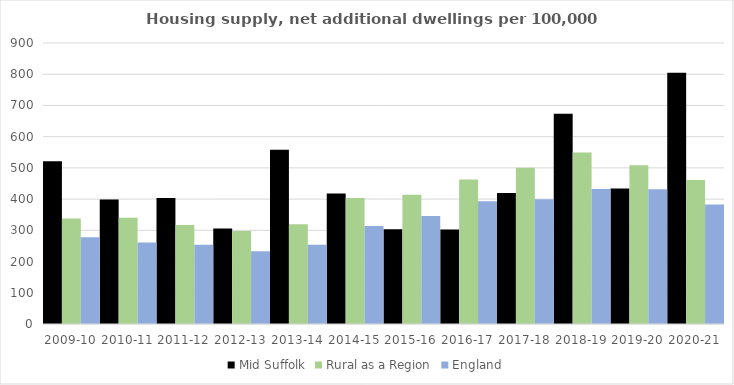
| Category | Mid Suffolk | Rural as a Region | England |
|---|---|---|---|
| 2009-10 | 521.365 | 337.852 | 277.548 |
| 2010-11 | 398.57 | 340.105 | 260.994 |
| 2011-12 | 403.807 | 317.04 | 254.007 |
| 2012-13 | 305.76 | 297.763 | 233.153 |
| 2013-14 | 557.751 | 319.835 | 253.602 |
| 2014-15 | 417.687 | 403.796 | 314.256 |
| 2015-16 | 303.239 | 414.091 | 346.154 |
| 2016-17 | 302.82 | 463.209 | 393.256 |
| 2017-18 | 419.527 | 500.68 | 399.646 |
| 2018-19 | 673.217 | 549.491 | 432.099 |
| 2019-20 | 434.092 | 508.493 | 431.187 |
| 2020-21 | 804.906 | 461.114 | 382.827 |